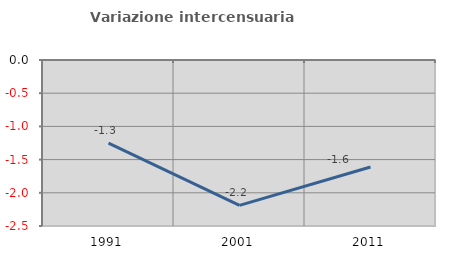
| Category | Variazione intercensuaria annua |
|---|---|
| 1991.0 | -1.251 |
| 2001.0 | -2.189 |
| 2011.0 | -1.611 |